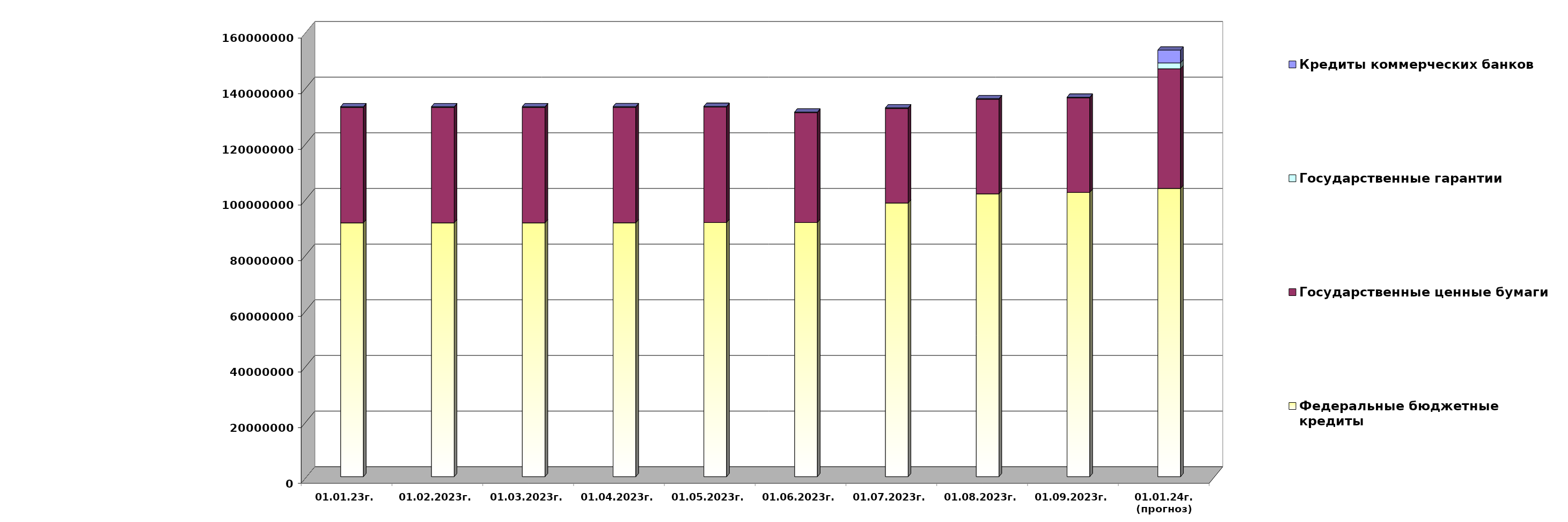
| Category | Федеральные бюджетные кредиты | Государственные ценные бумаги  | Государственные гарантии | Кредиты коммерческих банков |
|---|---|---|---|---|
| 01.01.23г. | 91228290.06 | 41500000 | 219957.743 | 0 |
| 01.02.2023г. | 91228290.06 | 41500000 | 217186.67 | 0 |
| 01.03.2023г. | 91228290.06 | 41500000 | 217186.67 | 0 |
| 01.04.2023г. | 91246617.843 | 41500000 | 218702.544 | 0 |
| 01.05.2023г. | 91334953.062 | 41500000 | 216632.858 | 0 |
| 01.06.2023г. | 91334953.062 | 39500000 | 201889.62 | 0 |
| 01.07.2023г. | 98352839.325 | 34000000 | 202402.323 | 0 |
| 01.08.2023г. | 101647637.335 | 34000000 | 198707.557 | 0 |
| 01.09.2023г. | 102154910.819 | 34000000 | 198971.052 | 0 |
| 01.01.24г.
(прогноз) | 103594267.9 | 43000000 | 2096427.8 | 4601422.3 |